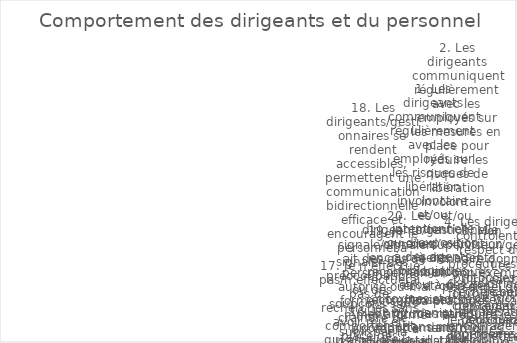
| Category | Series 0 |
|---|---|
| 1. Les dirigeants communiquent régulièrement avec les employés sur les risques de libération involontaire et/ou intentionnelle ou d’exposition à des agents biologiques et/ou à des toxines stockés ou manipulés dans mon installation. | 1 |
| 2. Les dirigeants communiquent régulièrement avec les employés sur les mesures en place pour réduire les risques de libération involontaire et/ou intentionnelle ou d’exposition à des agents biologiques et/ou à des toxines stockés ou manipulés dans mon ins | 5 |
| 3. Mon superviseur/gestionnaire donne un bon exemple personnel de pratiques visant à réduire les risques biologiques. | 0 |
| 4. Les dirigeants contrôlent le respect des procédures (ou protocoles de recherche) et des règles de conduite approuvées/validées. | 4 |
| 5. Les dirigeants fournissent les moyens nécessaires pour mettre en œuvre des mesures de biosécurité et de biosûreté. | 0 |
| 6. Les dirigeants de mon organisation encouragent les employés à accroître leur éducation et leur sensibilisation aux risques biologiques. | 3 |
| 7. Je suis convaincu que je peux déclarer moi-même une maladie ou d’autres conditions susceptibles d’affecter la biosécurité/biosûreté sans crainte de perdre mon emploi ni d’autres effets négatifs sur ma vie professionnelle/ma carrière.  | 3 |
| 8. Il n’est jamais approprié de suivre (« ferroutage ») un employé autorisé à entrer dans une zone réglementée. | 0 |
| 9. Je signale/signalerait un comportement inhabituel de mes collègues qui augmente le risque de libération involontaire et/ou intentionnelle d’agents biologiques et/ou de toxines, ou d’exposition à ces agents. | 1 |
| 10. Je suis engagé dans les processus d’évaluation des risques et de prise de décision pour réduire le risque de libération involontaire et/ou intentionnelle d’agents biologiques et/ou de toxines stockés ou manipulés dans mon installation. | 5 |
| 11. Mon organisation valorise la vigilance en matière de biosécurité et de biosûreté. | 4 |
| 12. Dans mon organisation, des mesures sont en place pour punir les violations délibérées de la biosécurité et de la biosûreté. | 0 |
| 13. Les dirigeants communiquent avec le personnel sur les attentes de performance spécifiques dans les domaines qui affectent la biosécurité et la biosûreté. | 2 |
| 14. Les employés participent aux processus d’évaluation des risques et de prise de décision et aux autres activités qui les concernent.  | 2 |
| 15. Tout le monde dans mon installation dispose correctement des matériaux contaminés. | 1 |
| 16. Un comportement qui améliore la culture de biosécurité et de biosûreté est renforcé par mes pairs. | 3 |
| 17. Je n’effectue pas/n’effectuerai pas de recherches sans avoir mis en place des mesures appropriées d’atténuation de risques. | 3 |
| 18. Les dirigeants/gestionnaires se rendent accessibles, permettent une communication bidirectionnelle efficace et encouragent le personnel à signaler des préoccupations ou des soupçons sans craindre de subir par la suite des mesures disciplinaires4. | 2 |
| 19. Je signale/signalerait des cas de personnel non autorisé ou mal formé/insuffisamment formé accédant à l’établissement.  | 5 |
| 20. Les dirigeants/gestionnaires encouragent, reconnaissent et récompensent les attitudes et comportements louables. | 1 |